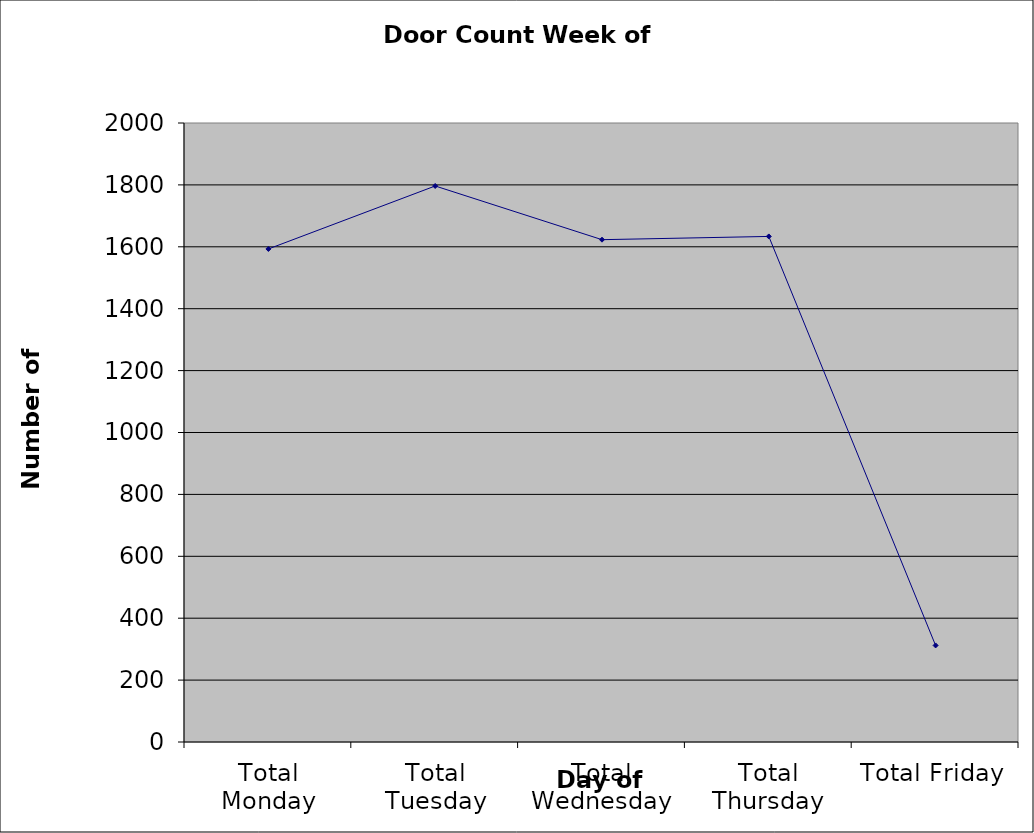
| Category | Series 0 |
|---|---|
| Total Monday | 1593 |
| Total Tuesday | 1796.5 |
| Total Wednesday | 1623 |
| Total Thursday | 1633.5 |
| Total Friday | 312 |